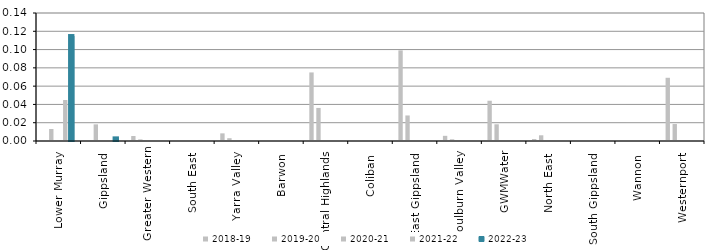
| Category | 2018-19 | 2019-20 | 2020-21 | 2021-22 | 2022-23 |
|---|---|---|---|---|---|
| Lower Murray  | 0 | 0.013 | 0 | 0.045 | 0.115 |
| Gippsland  | 0 | 0.018 | 0 | 0 | 0.003 |
| Greater Western | 0.005 | 0.002 | 0 | 0 | 0 |
| South East  | 0 | 0.001 | 0 | 0 | 0 |
| Yarra Valley  | 0.008 | 0.003 | 0 | 0 | 0 |
| Barwon  | 0 | 0 | 0 | 0 | 0 |
| Central Highlands  | 0.075 | 0.036 | 0 | 0 | 0 |
| Coliban  | 0 | 0 | 0 | 0 | 0 |
| East Gippsland  | 0.099 | 0.028 | 0 | 0 | 0 |
| Goulburn Valley  | 0.006 | 0.002 | 0 | 0 | 0 |
| GWMWater | 0.044 | 0.018 | 0 | 0 | 0 |
| North East  | 0.002 | 0.006 | 0 | 0 | 0 |
| South Gippsland  | 0 | 0 | 0 | 0 | 0 |
| Wannon  | 0 | 0 | 0 | 0 | 0 |
| Westernport  | 0.069 | 0.019 | 0 | 0 | 0 |